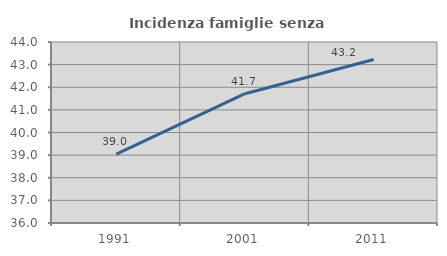
| Category | Incidenza famiglie senza nuclei |
|---|---|
| 1991.0 | 39.041 |
| 2001.0 | 41.714 |
| 2011.0 | 43.229 |